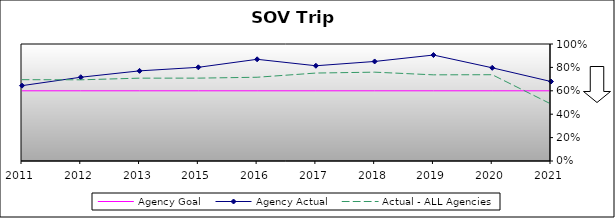
| Category | Agency Goal | Agency Actual | Actual - ALL Agencies |
|---|---|---|---|
| 2011.0 | 0.6 | 0.644 | 0.695 |
| 2012.0 | 0.6 | 0.716 | 0.694 |
| 2013.0 | 0.6 | 0.77 | 0.708 |
| 2015.0 | 0.6 | 0.801 | 0.708 |
| 2016.0 | 0.6 | 0.869 | 0.716 |
| 2017.0 | 0.6 | 0.814 | 0.752 |
| 2018.0 | 0.6 | 0.851 | 0.759 |
| 2019.0 | 0.6 | 0.906 | 0.736 |
| 2020.0 | 0.6 | 0.796 | 0.737 |
| 2021.0 | 0.6 | 0.679 | 0.487 |